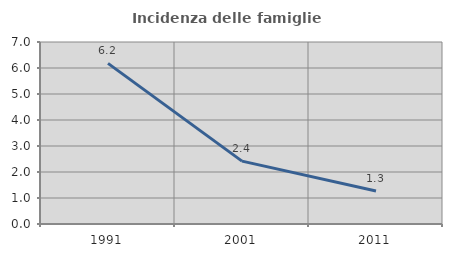
| Category | Incidenza delle famiglie numerose |
|---|---|
| 1991.0 | 6.177 |
| 2001.0 | 2.419 |
| 2011.0 | 1.271 |